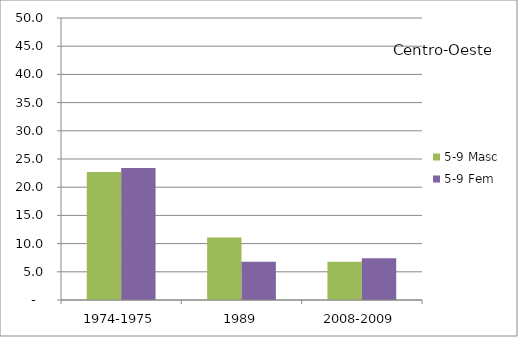
| Category | 5-9 Masc | 5-9 Fem |
|---|---|---|
| 1974-1975 | 22.7 | 23.4 |
| 1989 | 11.1 | 6.8 |
| 2008-2009 | 6.8 | 7.4 |